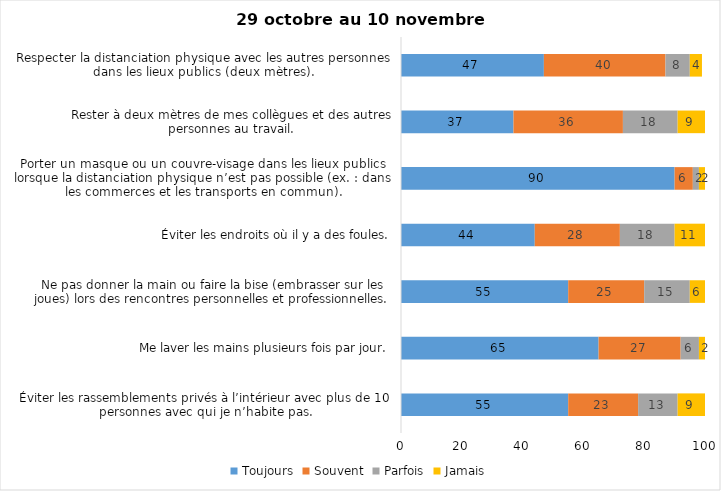
| Category | Toujours | Souvent | Parfois | Jamais |
|---|---|---|---|---|
| Éviter les rassemblements privés à l’intérieur avec plus de 10 personnes avec qui je n’habite pas. | 55 | 23 | 13 | 9 |
| Me laver les mains plusieurs fois par jour. | 65 | 27 | 6 | 2 |
| Ne pas donner la main ou faire la bise (embrasser sur les joues) lors des rencontres personnelles et professionnelles. | 55 | 25 | 15 | 6 |
| Éviter les endroits où il y a des foules. | 44 | 28 | 18 | 11 |
| Porter un masque ou un couvre-visage dans les lieux publics lorsque la distanciation physique n’est pas possible (ex. : dans les commerces et les transports en commun). | 90 | 6 | 2 | 2 |
| Rester à deux mètres de mes collègues et des autres personnes au travail. | 37 | 36 | 18 | 9 |
| Respecter la distanciation physique avec les autres personnes dans les lieux publics (deux mètres). | 47 | 40 | 8 | 4 |